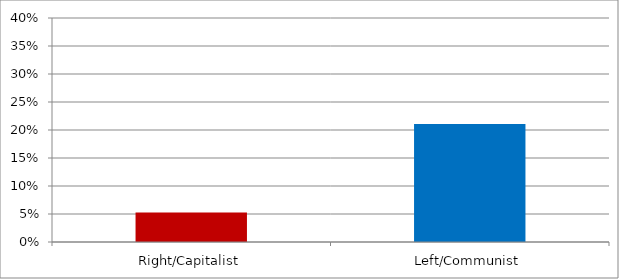
| Category | Democrat Election |
|---|---|
| Right/Capitalist | 0.053 |
| Left/Communist | 0.211 |